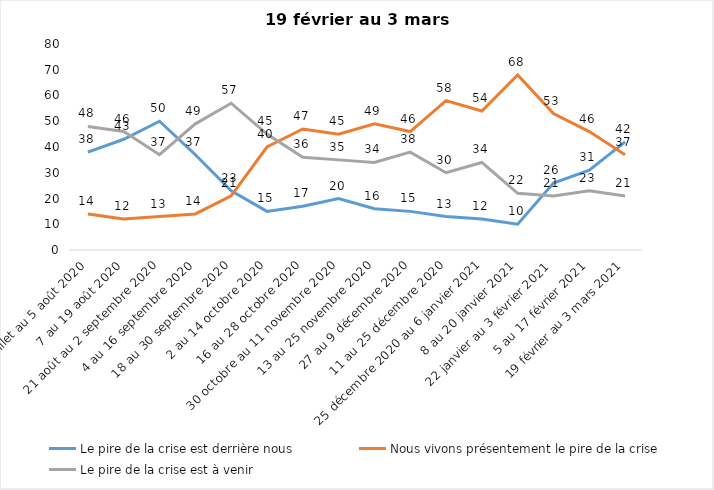
| Category | Le pire de la crise est derrière nous | Nous vivons présentement le pire de la crise | Le pire de la crise est à venir |
|---|---|---|---|
| 24 juillet au 5 août 2020 | 38 | 14 | 48 |
| 7 au 19 août 2020 | 43 | 12 | 46 |
| 21 août au 2 septembre 2020 | 50 | 13 | 37 |
| 4 au 16 septembre 2020 | 37 | 14 | 49 |
| 18 au 30 septembre 2020 | 23 | 21 | 57 |
| 2 au 14 octobre 2020 | 15 | 40 | 45 |
| 16 au 28 octobre 2020 | 17 | 47 | 36 |
| 30 octobre au 11 novembre 2020 | 20 | 45 | 35 |
| 13 au 25 novembre 2020 | 16 | 49 | 34 |
| 27 au 9 décembre 2020 | 15 | 46 | 38 |
| 11 au 25 décembre 2020 | 13 | 58 | 30 |
| 25 décembre 2020 au 6 janvier 2021 | 12 | 54 | 34 |
| 8 au 20 janvier 2021 | 10 | 68 | 22 |
| 22 janvier au 3 février 2021 | 26 | 53 | 21 |
| 5 au 17 février 2021 | 31 | 46 | 23 |
| 19 février au 3 mars 2021 | 42 | 37 | 21 |